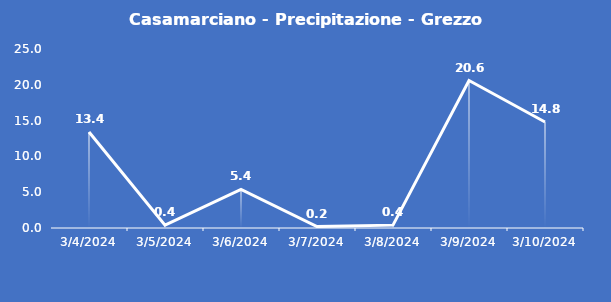
| Category | Casamarciano - Precipitazione - Grezzo (mm) |
|---|---|
| 3/4/24 | 13.4 |
| 3/5/24 | 0.4 |
| 3/6/24 | 5.4 |
| 3/7/24 | 0.2 |
| 3/8/24 | 0.4 |
| 3/9/24 | 20.6 |
| 3/10/24 | 14.8 |